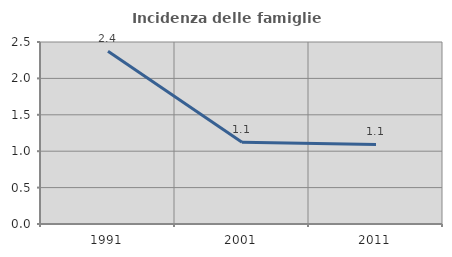
| Category | Incidenza delle famiglie numerose |
|---|---|
| 1991.0 | 2.374 |
| 2001.0 | 1.124 |
| 2011.0 | 1.093 |